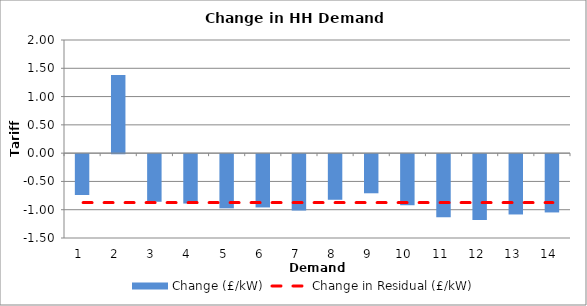
| Category | Change (£/kW) |
|---|---|
| 1.0 | -0.722 |
| 2.0 | 1.382 |
| 3.0 | -0.842 |
| 4.0 | -0.874 |
| 5.0 | -0.958 |
| 6.0 | -0.942 |
| 7.0 | -0.997 |
| 8.0 | -0.807 |
| 9.0 | -0.692 |
| 10.0 | -0.903 |
| 11.0 | -1.113 |
| 12.0 | -1.162 |
| 13.0 | -1.066 |
| 14.0 | -1.031 |